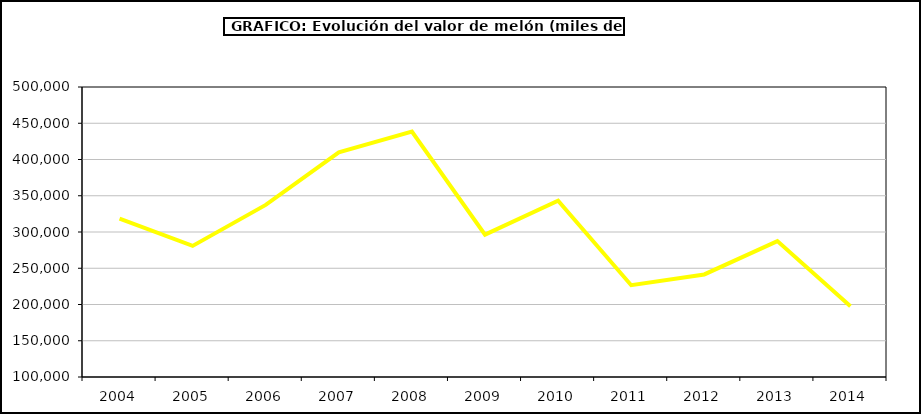
| Category | Valor |
|---|---|
| 2004.0 | 318561.2 |
| 2005.0 | 280807.931 |
| 2006.0 | 337363.062 |
| 2007.0 | 409844.546 |
| 2008.0 | 438449.843 |
| 2009.0 | 296322.107 |
| 2010.0 | 343061.749 |
| 2011.0 | 226631.76 |
| 2012.0 | 241464.672 |
| 2013.0 | 287421.365 |
| 2014.0 | 197555.814 |